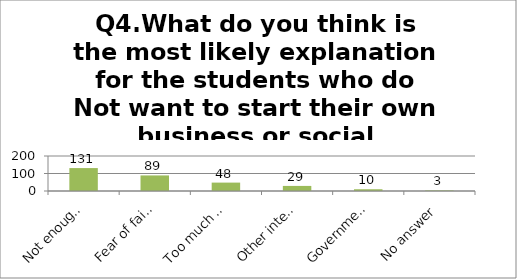
| Category | Q4.What do you think is the most likely explanation for the students who do Not want to start their own business or social enterprise? |
|---|---|
| Not enough money to get a business started | 131 |
| Fear of faiulure | 89 |
| Too much work | 48 |
| Other interests | 29 |
| Government obstacles | 10 |
| No answer | 3 |